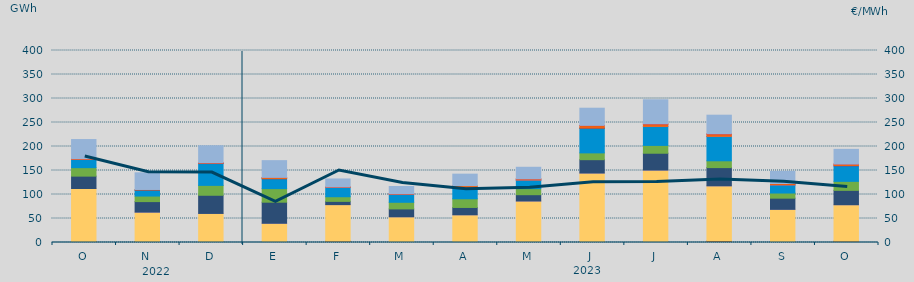
| Category | Carbón | Ciclo Combinado | Cogeneración | Consumo Bombeo | Eólica | Hidráulica | Nuclear | Otras Renovables | Solar fotovoltaica | Solar térmica | Turbinación bombeo |
|---|---|---|---|---|---|---|---|---|---|---|---|
| O | 1876.1 | 110603.205 | 45 | 25745.4 | 17659.375 | 17006.05 | 12.825 | 16.6 | 1409.775 | 15.5 | 40055.836 |
| N | 1396.025 | 61724.955 | 198.008 | 21869.975 | 11579.495 | 12449.175 | 266.725 | 0 | 996.225 | 0 | 34713.224 |
| D | 1126.208 | 59335.684 | 104.85 | 37837.8 | 20596.98 | 45465.168 | 544.3 | 0 | 1011.875 | 1.5 | 35471.986 |
| E | 478.95 | 39560.875 | 26.867 | 43909.242 | 28275.092 | 20601.292 | 143.6 | 0 | 2603.242 | 1.5 | 34937.333 |
| F | 2850.925 | 76083.275 | 1.55 | 6739.65 | 9661.175 | 19240.1 | 0 | 0 | 962.675 | 47.25 | 16781.025 |
| M | 1195.025 | 52392.533 | 3.3 | 16393.158 | 13789.6 | 16980.517 | 40.625 | 4.5 | 911.6 | 43.15 | 14940.475 |
| A | 218.875 | 57485.65 | 46.225 | 15258.175 | 18096.25 | 24086.65 | 63.45 | 0 | 3316.075 | 0 | 23819.559 |
| M | 150.482 | 86315.465 | 30 | 13099.874 | 12607.441 | 17784.926 | 256.325 | 2 | 2256.963 | 1.5 | 24199.004 |
| J | 1968.975 | 142738.351 | 35.225 | 27797.375 | 14167.175 | 51399.925 | 228.125 | 0 | 5290.65 | 319.5 | 35835.25 |
| J | 1606.69 | 149175.946 | 137.975 | 35048.925 | 16290.2 | 39637.497 | 0 | 5 | 4774.95 | 398.125 | 50276.3 |
| A | 2991.569 | 115032.711 | 108.25 | 37912.341 | 14171.547 | 50649.252 | 261.175 | 69.9 | 4696.2 | 414.625 | 38918.209 |
| S | 1098.882 | 67978.9 | 0.25 | 23304.2 | 10673.95 | 16895.894 | 188.6 | 32.7 | 2616.325 | 77.25 | 25361.951 |
| O | 2715.032 | 75984.499 | 16.5 | 29926.75 | 18741.87 | 32145.415 | 710.65 | 39.9 | 2928.133 | 55.25 | 30795.542 |